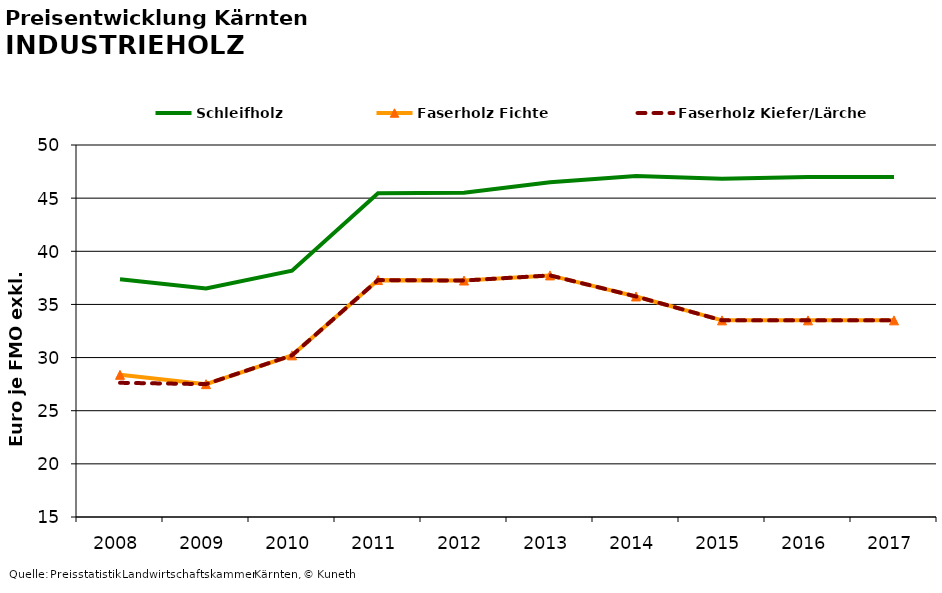
| Category | Schleifholz | Faserholz Fichte | Faserholz Kiefer/Lärche |
|---|---|---|---|
| 2008.0 | 37.375 | 28.375 | 27.625 |
| 2009.0 | 36.5 | 27.5 | 27.5 |
| 2010.0 | 38.167 | 30.208 | 30.208 |
| 2011.0 | 45.458 | 37.292 | 37.292 |
| 2012.0 | 45.5 | 37.25 | 37.25 |
| 2013.0 | 46.5 | 37.729 | 37.729 |
| 2014.0 | 47.083 | 35.75 | 35.75 |
| 2015.0 | 46.833 | 33.5 | 33.5 |
| 2016.0 | 47 | 33.5 | 33.5 |
| 2017.0 | 47 | 33.5 | 33.5 |